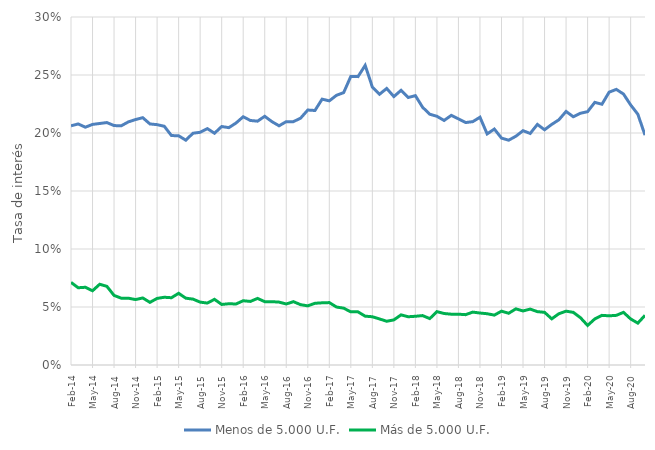
| Category | Menos de 5.000 U.F. | Más de 5.000 U.F. |
|---|---|---|
| 2014-02-01 | 0.206 | 0.071 |
| 2014-03-01 | 0.208 | 0.067 |
| 2014-04-01 | 0.205 | 0.067 |
| 2014-05-01 | 0.207 | 0.064 |
| 2014-06-01 | 0.208 | 0.07 |
| 2014-07-01 | 0.209 | 0.068 |
| 2014-08-01 | 0.206 | 0.06 |
| 2014-09-01 | 0.206 | 0.058 |
| 2014-10-01 | 0.21 | 0.058 |
| 2014-11-01 | 0.212 | 0.056 |
| 2014-12-01 | 0.213 | 0.058 |
| 2015-01-01 | 0.208 | 0.054 |
| 2015-02-01 | 0.207 | 0.057 |
| 2015-03-01 | 0.206 | 0.058 |
| 2015-04-01 | 0.198 | 0.058 |
| 2015-05-01 | 0.198 | 0.062 |
| 2015-06-01 | 0.194 | 0.058 |
| 2015-07-01 | 0.2 | 0.057 |
| 2015-08-01 | 0.201 | 0.054 |
| 2015-09-01 | 0.204 | 0.053 |
| 2015-10-01 | 0.2 | 0.057 |
| 2015-11-01 | 0.206 | 0.052 |
| 2015-12-01 | 0.205 | 0.053 |
| 2016-01-01 | 0.209 | 0.053 |
| 2016-02-01 | 0.214 | 0.055 |
| 2016-03-01 | 0.211 | 0.055 |
| 2016-04-01 | 0.21 | 0.057 |
| 2016-05-01 | 0.214 | 0.055 |
| 2016-06-01 | 0.21 | 0.055 |
| 2016-07-01 | 0.206 | 0.054 |
| 2016-08-01 | 0.21 | 0.053 |
| 2016-09-01 | 0.21 | 0.055 |
| 2016-10-01 | 0.213 | 0.052 |
| 2016-11-01 | 0.22 | 0.051 |
| 2016-12-01 | 0.219 | 0.053 |
| 2017-01-01 | 0.229 | 0.054 |
| 2017-02-01 | 0.228 | 0.054 |
| 2017-03-01 | 0.232 | 0.05 |
| 2017-04-01 | 0.235 | 0.049 |
| 2017-05-01 | 0.249 | 0.046 |
| 2017-06-01 | 0.249 | 0.046 |
| 2017-07-01 | 0.258 | 0.042 |
| 2017-08-01 | 0.24 | 0.042 |
| 2017-09-01 | 0.233 | 0.04 |
| 2017-10-01 | 0.238 | 0.038 |
| 2017-11-01 | 0.231 | 0.039 |
| 2017-12-01 | 0.237 | 0.043 |
| 2018-01-01 | 0.231 | 0.042 |
| 2018-02-01 | 0.232 | 0.042 |
| 2018-03-01 | 0.222 | 0.043 |
| 2018-04-01 | 0.216 | 0.04 |
| 2018-05-01 | 0.214 | 0.046 |
| 2018-06-01 | 0.211 | 0.044 |
| 2018-07-01 | 0.215 | 0.044 |
| 2018-08-01 | 0.212 | 0.044 |
| 2018-09-01 | 0.209 | 0.043 |
| 2018-10-01 | 0.21 | 0.046 |
| 2018-11-01 | 0.214 | 0.045 |
| 2018-12-01 | 0.199 | 0.044 |
| 2019-01-01 | 0.203 | 0.043 |
| 2019-02-01 | 0.196 | 0.046 |
| 2019-03-01 | 0.194 | 0.045 |
| 2019-04-01 | 0.197 | 0.048 |
| 2019-05-01 | 0.202 | 0.047 |
| 2019-06-01 | 0.2 | 0.048 |
| 2019-07-01 | 0.207 | 0.046 |
| 2019-08-01 | 0.203 | 0.045 |
| 2019-09-01 | 0.207 | 0.04 |
| 2019-10-01 | 0.211 | 0.044 |
| 2019-11-01 | 0.219 | 0.046 |
| 2019-12-01 | 0.214 | 0.045 |
| 2020-01-01 | 0.217 | 0.041 |
| 2020-02-01 | 0.218 | 0.034 |
| 2020-03-01 | 0.226 | 0.04 |
| 2020-04-01 | 0.225 | 0.043 |
| 2020-05-01 | 0.235 | 0.042 |
| 2020-06-01 | 0.238 | 0.043 |
| 2020-07-01 | 0.234 | 0.045 |
| 2020-08-01 | 0.224 | 0.04 |
| 2020-09-01 | 0.216 | 0.036 |
| 2020-10-01 | 0.198 | 0.043 |